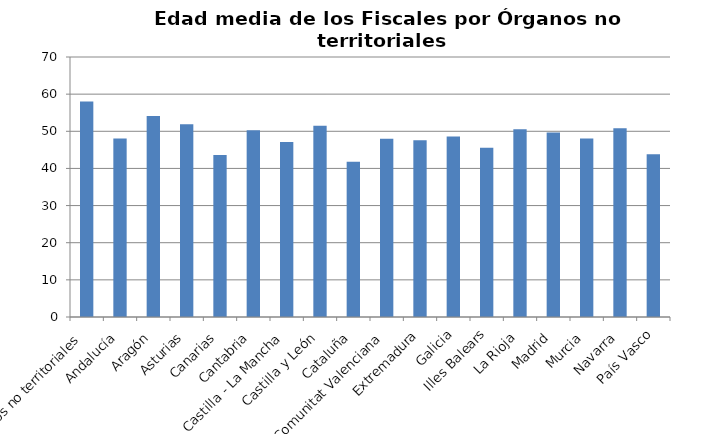
| Category | Edad Media |
|---|---|
| Órganos no territoriales | 58.034 |
| Andalucía | 48.087 |
| Aragón | 54.097 |
| Asturias | 51.88 |
| Canarias | 43.598 |
| Cantabria | 50.276 |
| Castilla - La Mancha | 47.114 |
| Castilla y León | 51.484 |
| Cataluña | 41.83 |
| Comunitat Valenciana | 47.989 |
| Extremadura | 47.554 |
| Galicia | 48.585 |
| Illes Balears | 45.554 |
| La Rioja | 50.571 |
| Madrid | 49.659 |
| Murcia | 48.077 |
| Navarra | 50.81 |
| País Vasco | 43.842 |